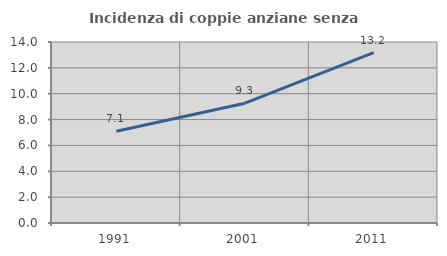
| Category | Incidenza di coppie anziane senza figli  |
|---|---|
| 1991.0 | 7.098 |
| 2001.0 | 9.266 |
| 2011.0 | 13.186 |